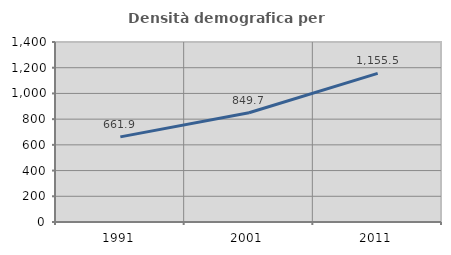
| Category | Densità demografica |
|---|---|
| 1991.0 | 661.896 |
| 2001.0 | 849.732 |
| 2011.0 | 1155.472 |